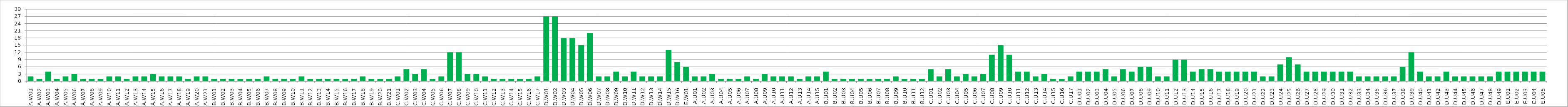
| Category | Series 0 |
|---|---|
| A.W01 | 2 |
| A.W02 | 1 |
| A.W03 | 4 |
| A.W04 | 1 |
| A.W05 | 2 |
| A.W06 | 3 |
| A.W07 | 1 |
| A.W08 | 1 |
| A.W09 | 1 |
| A.W10 | 2 |
| A.W11 | 2 |
| A.W12 | 1 |
| A.W13 | 2 |
| A.W14 | 2 |
| A.W15 | 3 |
| A.W16 | 2 |
| A.W17 | 2 |
| A.W18 | 2 |
| A.W19 | 1 |
| A.W20 | 2 |
| A.W21 | 2 |
| B.W01 | 1 |
| B.W02 | 1 |
| B.W03 | 1 |
| B.W04 | 1 |
| B.W05 | 1 |
| B.W06 | 1 |
| B.W07 | 2 |
| B.W08 | 1 |
| B.W09 | 1 |
| B.W10 | 1 |
| B.W11 | 2 |
| B.W12 | 1 |
| B.W13 | 1 |
| B.W14 | 1 |
| B.W15 | 1 |
| B.W16 | 1 |
| B.W17 | 1 |
| B.W18 | 2 |
| B.W19 | 1 |
| B.W20 | 1 |
| B.W21 | 1 |
| C.W01 | 2 |
| C.W02 | 5 |
| C.W03 | 3 |
| C.W04 | 5 |
| C.W05 | 1 |
| C.W06 | 2 |
| C.W07 | 12 |
| C.W08 | 12 |
| C.W09 | 3 |
| C.W10 | 3 |
| C.W11 | 2 |
| C.W12 | 1 |
| C.W13 | 1 |
| C.W14 | 1 |
| C.W15 | 1 |
| C.W16 | 1 |
| C.W17 | 2 |
| D.W01 | 27 |
| D.W02 | 27 |
| D.W03 | 18 |
| D.W04 | 18 |
| D.W05 | 15 |
| D.W06 | 20 |
| D.W07 | 2 |
| D.W08 | 2 |
| D.W09 | 4 |
| D.W10 | 2 |
| D.W11 | 4 |
| D.W12 | 2 |
| D.W13 | 2 |
| D.W14 | 2 |
| D.W15 | 13 |
| D.W16 | 8 |
| E.W01 | 6 |
| A.U01 | 2 |
| A.U02 | 2 |
| A.U03 | 3 |
| A.U04 | 1 |
| A.U05 | 1 |
| A.U06 | 1 |
| A.U07 | 2 |
| A.U08 | 1 |
| A.U09 | 3 |
| A.U10 | 2 |
| A.U11 | 2 |
| A.U12 | 2 |
| A.U13 | 1 |
| A.U14 | 2 |
| A.U15 | 2 |
| B.U01 | 4 |
| B.U02 | 1 |
| B.U03 | 1 |
| B.U04 | 1 |
| B.U05 | 1 |
| B.U06 | 1 |
| B.U07 | 1 |
| B.U08 | 1 |
| B.U09 | 2 |
| B.U10 | 1 |
| B.U11 | 1 |
| B.U12 | 1 |
| C.U01 | 5 |
| C.U02 | 2 |
| C.U03 | 5 |
| C.U04 | 2 |
| C.U05 | 3 |
| C.U06 | 2 |
| C.U07 | 3 |
| C.U08 | 11 |
| C.U09 | 15 |
| C.U10 | 11 |
| C.U11 | 4 |
| C.U12 | 4 |
| C.U13 | 2 |
| C.U14 | 3 |
| C.U15 | 1 |
| C.U16 | 1 |
| C.U17 | 2 |
| D.U01 | 4 |
| D.U02 | 4 |
| D.U03 | 4 |
| D.U04 | 5 |
| D.U05 | 2 |
| D.U06 | 5 |
| D.U07 | 4 |
| D.U08 | 6 |
| D.U09 | 6 |
| D.U10 | 2 |
| D.U11 | 2 |
| D.U12 | 9 |
| D.U13 | 9 |
| D.U14 | 4 |
| D.U15 | 5 |
| D.U16 | 5 |
| D.U17 | 4 |
| D.U18 | 4 |
| D.U19 | 4 |
| D.U20 | 4 |
| D.U21 | 4 |
| D.U22 | 2 |
| D.U23 | 2 |
| D.U24 | 7 |
| D.U25 | 10 |
| D.U26 | 7 |
| D.U27 | 4 |
| D.U28 | 4 |
| D.U29 | 4 |
| D.U30 | 4 |
| D.U31 | 4 |
| D.U32 | 4 |
| D.U33 | 2 |
| D.U34 | 2 |
| D.U35 | 2 |
| D.U36 | 2 |
| D.U37 | 2 |
| D.U38 | 6 |
| D.U39 | 12 |
| D.U40 | 4 |
| D.U41 | 2 |
| D.U42 | 2 |
| D.U43 | 4 |
| D.U44 | 2 |
| D.U45 | 2 |
| D.U46 | 2 |
| D.U47 | 2 |
| D.U48 | 2 |
| D.U49 | 4 |
| E.U01 | 4 |
| E.U02 | 4 |
| E.U03 | 4 |
| E.U04 | 4 |
| E.U05 | 4 |